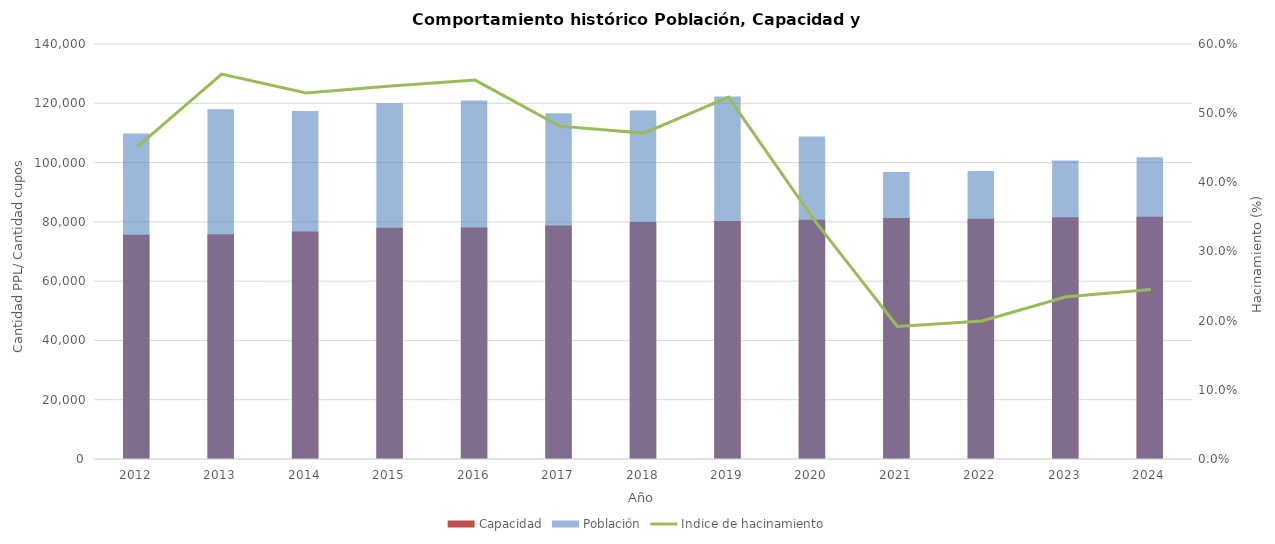
| Category | Capacidad | Población |
|---|---|---|
| 2012.0 | 75679.167 | 109822.083 |
| 2013.0 | 75796.583 | 117986.5 |
| 2014.0 | 76777 | 117389.083 |
| 2015.0 | 77979.75 | 120040.083 |
| 2016.0 | 78119.5 | 120914 |
| 2017.0 | 78759 | 116657.667 |
| 2018.0 | 79914 | 117569.583 |
| 2019.0 | 80296.167 | 122309.5 |
| 2020.0 | 80704.167 | 108777.75 |
| 2021.0 | 81268.833 | 96837.5 |
| 2022.0 | 81010.417 | 97175.917 |
| 2023.0 | 81594 | 100737.75 |
| 2024.0 | 81740 | 101781 |